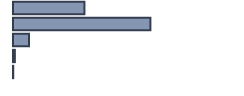
| Category | Series 0 |
|---|---|
| 0 | 31.468 |
| 1 | 60.528 |
| 2 | 7.083 |
| 3 | 0.819 |
| 4 | 0.101 |